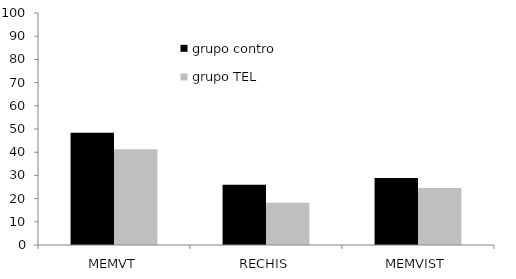
| Category | grupo control | grupo TEL |
|---|---|---|
| MEMVT | 48.438 | 41.25 |
| RECHIS | 26 | 18.222 |
| MEMVIST | 28.924 | 24.583 |